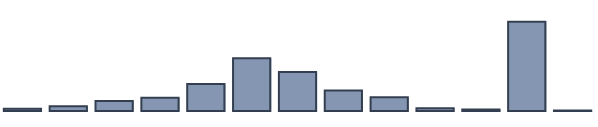
| Category | Series 0 |
|---|---|
| 0 | 0.817 |
| 1 | 1.691 |
| 2 | 3.647 |
| 3 | 4.749 |
| 4 | 9.711 |
| 5 | 19.036 |
| 6 | 14.069 |
| 7 | 7.423 |
| 8 | 4.968 |
| 9 | 1.016 |
| 10 | 0.566 |
| 11 | 32.156 |
| 12 | 0.151 |